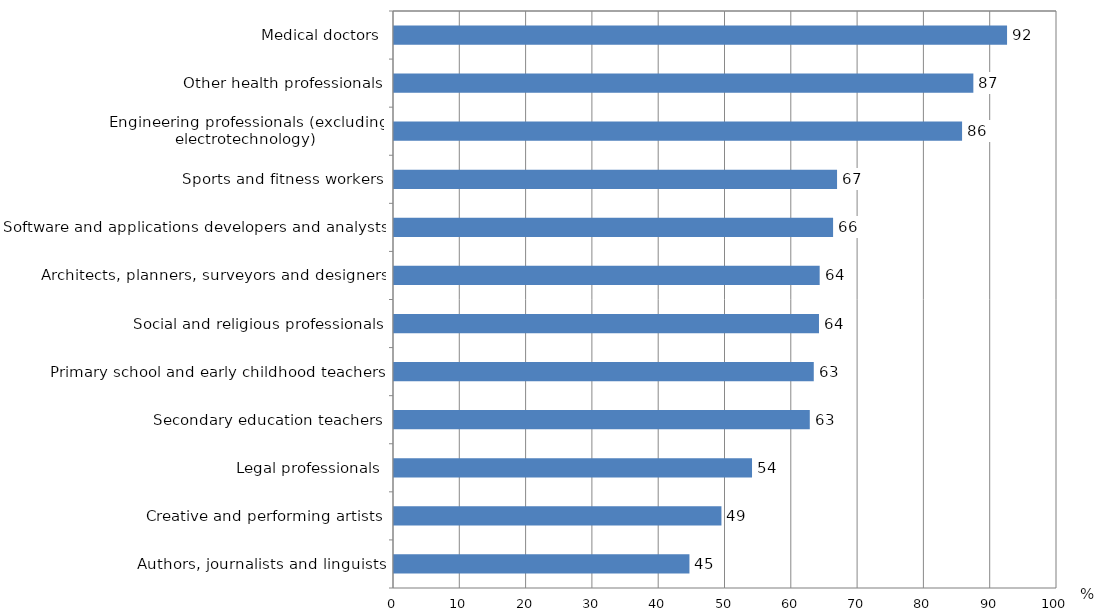
| Category | Series 0 |
|---|---|
| Medical doctors | 92.467 |
| Other health professionals | 87.384 |
| Engineering professionals (excluding electrotechnology) | 85.683 |
| Sports and fitness workers | 66.825 |
| Software and applications developers and analysts | 66.227 |
| Architects, planners, surveyors and designers | 64.204 |
| Social and religious professionals | 64.1 |
| Primary school and early childhood teachers | 63.314 |
| Secondary education teachers | 62.714 |
| Legal professionals | 54.001 |
| Creative and performing artists | 49.388 |
| Authors, journalists and linguists | 44.562 |